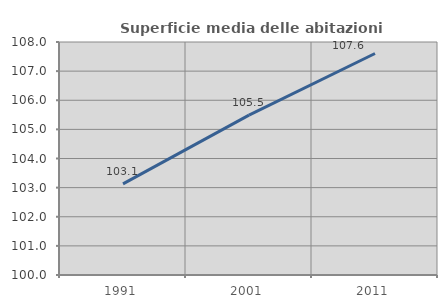
| Category | Superficie media delle abitazioni occupate |
|---|---|
| 1991.0 | 103.127 |
| 2001.0 | 105.487 |
| 2011.0 | 107.606 |